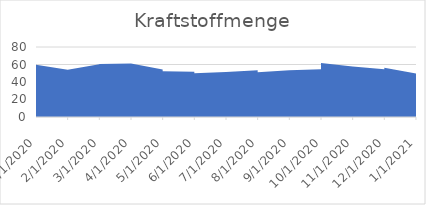
| Category | Series 0 |
|---|---|
| 1/2/20 | 58.34 |
| 1/22/20 | 59.65 |
| 2/11/20 | 53.95 |
| 3/2/20 | 60.15 |
| 3/22/20 | 60.5 |
| 4/11/20 | 61.25 |
| 5/1/20 | 54.25 |
| 5/21/20 | 52.34 |
| 6/10/20 | 51.59 |
| 6/30/20 | 49.98 |
| 7/20/20 | 51.52 |
| 8/9/20 | 53.45 |
| 8/29/20 | 51.25 |
| 9/18/20 | 53.46 |
| 10/8/20 | 54.45 |
| 10/28/20 | 61.85 |
| 11/17/20 | 57.85 |
| 12/7/20 | 54.56 |
| 12/27/20 | 56.24 |
| 1/16/21 | 49.85 |